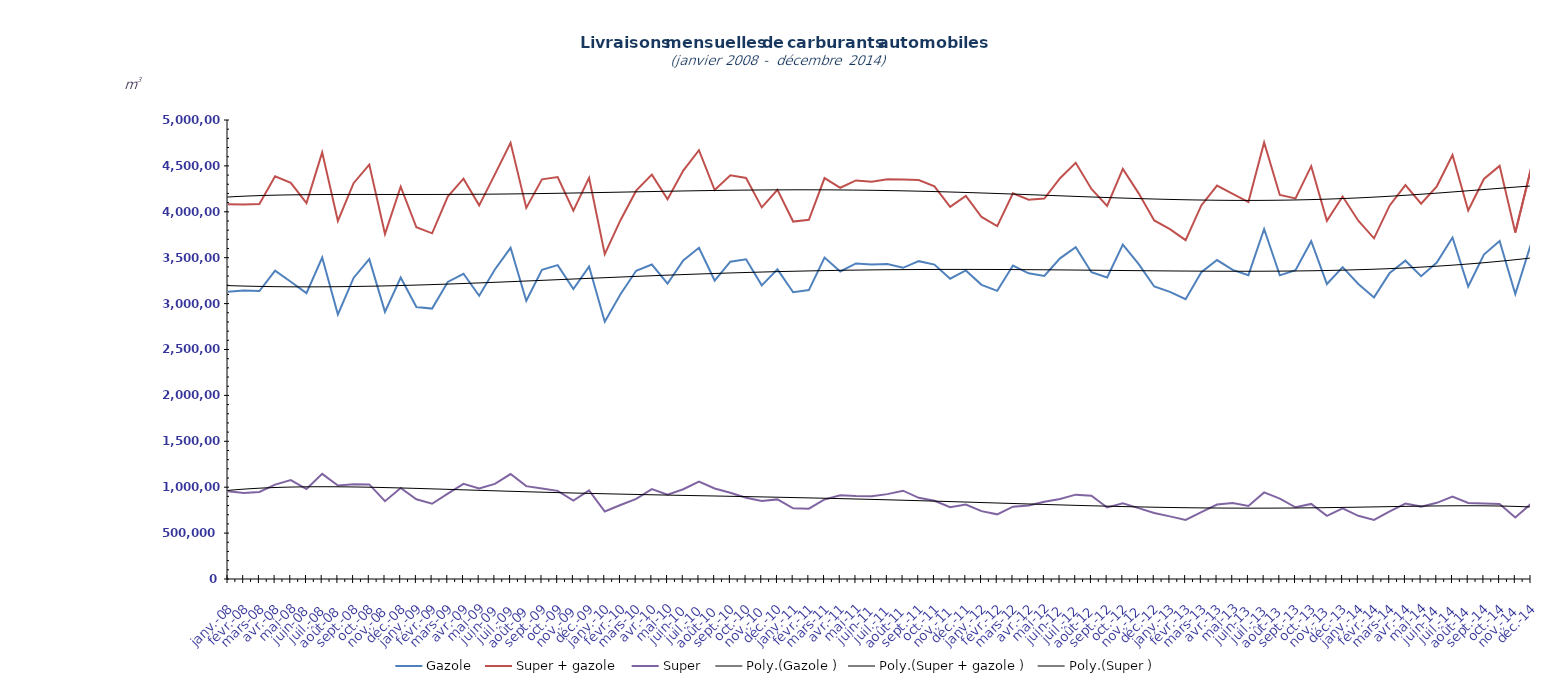
| Category | Gazole  | Super + gazole  | Super  |
|---|---|---|---|
| janv.-08 | 3128429 | 4083103 | 954674 |
| févr.-08 | 3142671 | 4078437 | 935766 |
| mars-08 | 3136810 | 4084308 | 947498 |
| avr.-08 | 3358712 | 4386865 | 1028153 |
| mai-08 | 3237586 | 4314987 | 1077401 |
| juin-08 | 3114118 | 4094200 | 980082 |
| juil.-08 | 3501735 | 4647267 | 1145532 |
| août-08 | 2882269 | 3900099 | 1017830 |
| sept.-08 | 3279390 | 4311740 | 1032350 |
| oct.-08 | 3483736 | 4514232 | 1030496 |
| nov.-08 | 2909509 | 3757166 | 847657 |
| déc.-08 | 3283544 | 4274323 | 990779 |
| janv.-09 | 2963156 | 3831258 | 868102 |
| févr.-09 | 2945830 | 3765488 | 819658 |
| mars-09 | 3235612 | 4166306 | 930694 |
| avr.-09 | 3324798 | 4361219 | 1036421 |
| mai-09 | 3085280 | 4070342 | 985062 |
| juin-09 | 3371130 | 4407532 | 1036402 |
| juil.-09 | 3607631 | 4751095 | 1143464 |
| août-09 | 3031131 | 4042777 | 1011646 |
| sept.-09 | 3367707 | 4353159 | 985452 |
| oct.-09 | 3419025 | 4379035 | 960010 |
| nov.-09 | 3158350 | 4013011 | 854661 |
| déc.-09 | 3403213 | 4369148 | 965935 |
| janv.-10 | 2803347 | 3538634 | 735287 |
| févr.-10 | 3102717 | 3908836 | 806119 |
| mars-10 | 3357715 | 4230292 | 872577 |
| avr.-10 | 3425151 | 4404482 | 979331 |
| mai-10 | 3218448 | 4137107 | 918659 |
| juin-10 | 3470622 | 4448376 | 977754 |
| juil.-10 | 3608418 | 4670592 | 1062174 |
| août-10 | 3251147 | 4236685 | 985538 |
| sept.-10 | 3456881 | 4396780 | 939899 |
| oct.-10 | 3482921 | 4368322 | 885401 |
| nov.-10 | 3198447 | 4048094 | 849647 |
| déc.-10 | 3373389 | 4240618 | 867229 |
| janv.-11 | 3124022 | 3893623 | 769601 |
| févr.-11 | 3146982 | 3913075 | 766093 |
| mars-11 | 3501328 | 4367512 | 866184 |
| avr.-11 | 3349900 | 4261798 | 911898 |
| mai-11 | 3437605 | 4341481 | 903876 |
| juin-11 | 3426248 | 4327814 | 901566 |
| juil.-11 | 3430118 | 4354733 | 924615 |
| août-11 | 3389992 | 4351833 | 961841 |
| sept.-11 | 3462372 | 4346909 | 884537 |
| oct.-11 | 3425388 | 4277997 | 852609 |
| nov.-11 | 3271565 | 4053229 | 781664 |
| déc.-11 | 3361549 | 4173550 | 812001 |
| janv.-12 | 3204494 | 3943594 | 739100 |
| févr.-12 | 3138929 | 3843257 | 704328 |
| mars-12 | 3414459 | 4201925 | 787466 |
| avr.-12 | 3330354 | 4131315 | 800961 |
| mai-12 | 3302032 | 4144036 | 842004 |
| juin-12 | 3493318 | 4365641 | 872323 |
| juil.-12 | 3614726 | 4533649 | 918923 |
| août-12 | 3342089 | 4248776 | 906687 |
| sept.-12 | 3284293 | 4063318 | 779025 |
| oct.-12 | 3642641 | 4466735 | 824094 |
| nov.-12 | 3431865 | 4203546 | 771681 |
| déc.-12 | 3186443 | 3905734 | 719291 |
| janv.-13 | 3128345 | 3810640 | 682295 |
| févr.-13 | 3048535 | 3691425 | 642890 |
| mars-13 | 3341144 | 4069287 | 728143 |
| avr.-13 | 3474241 | 4285528 | 811287 |
| mai-13 | 3366662 | 4194483 | 827821 |
| juin-13 | 3309833 | 4105811 | 795978 |
| juil.-13 | 3812632 | 4755641 | 943009 |
| août-13 | 3307939 | 4183142 | 875203 |
| sept.-13 | 3364368 | 4145516 | 781148 |
| oct.-13 | 3679417 | 4497004 | 817587 |
| nov.-13 | 3212946 | 3901622 | 688676 |
| déc.-13 | 3397439 | 4166816 | 769377 |
| janv.-14 | 3214163 | 3902779 | 688616 |
| févr.-14 | 3067410 | 3711132 | 643722 |
| mars-14 | 3333627 | 4069463 | 735836 |
| avr.-14 | 3467664 | 4290259 | 822595 |
| mai-14 | 3299055 | 4087709 | 788654 |
| juin-14 | 3447730 | 4277679 | 829949 |
| juil.-14 | 3719997 | 4618448 | 898451 |
| août-14 | 3185786 | 4013774 | 827988 |
| sept.-14 | 3534445 | 4357929 | 823484 |
| oct.-14 | 3682624 | 4500198 | 817574 |
| nov.-14 | 3104552 | 3775169 | 670617 |
| déc.-14 | 3649225 | 4469377 | 820152 |